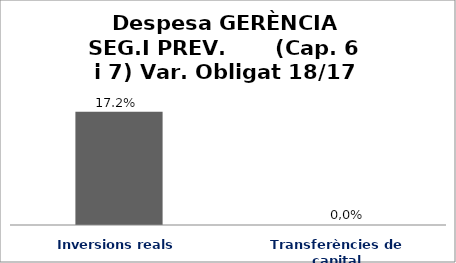
| Category | Series 0 |
|---|---|
| Inversions reals | 0.172 |
| Transferències de capital | 0 |